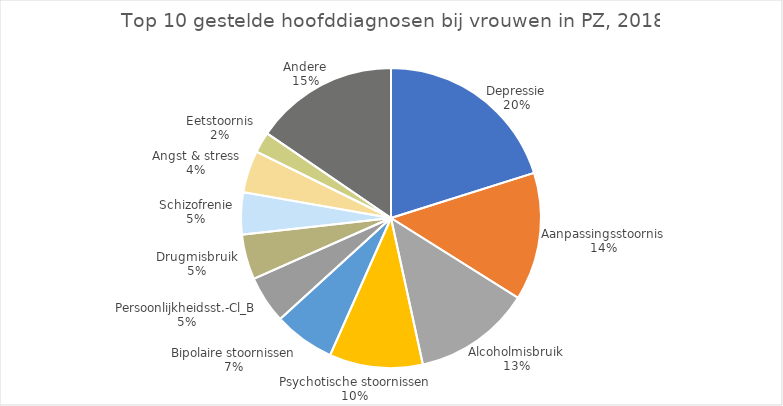
| Category | Aantal verblijven |
|---|---|
| Depressie | 4995 |
| Aanpassingsstoornis | 3419 |
| Alcoholmisbruik | 3141 |
| Psychotische stoornissen | 2495 |
| Bipolaire stoornissen | 1634 |
| Persoonlijkheidsst.-Cl_B | 1270 |
| Drugmisbruik | 1208 |
| Schizofrenie | 1124 |
| Angst & stress | 1123 |
| Eetstoornis | 557 |
| Andere | 3836 |